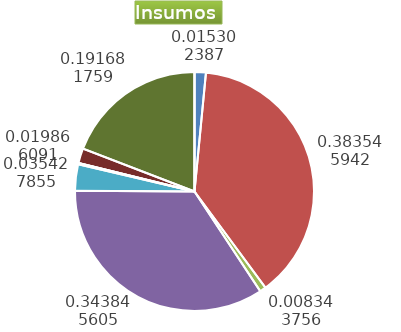
| Category | Series 0 |
|---|---|
| Control arvenses | 2011080 |
| Control fitosanitario | 50406619 |
| Cosecha y beneficio | 1096558.471 |
| Fertilización | 45189096 |
| Instalación | 4656022.081 |
| Otros | 261085 |
| Podas | 0 |
| Riego | 2610854 |
| Transporte | 25191322.2 |
| Tutorado | 0 |